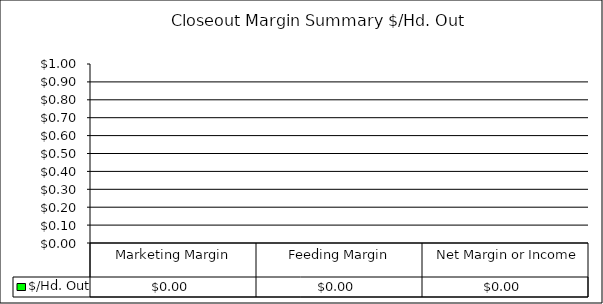
| Category | $/Hd. Out |
|---|---|
| Marketing Margin | 0 |
| Feeding Margin | 0 |
|  Net Margin or Income | 0 |